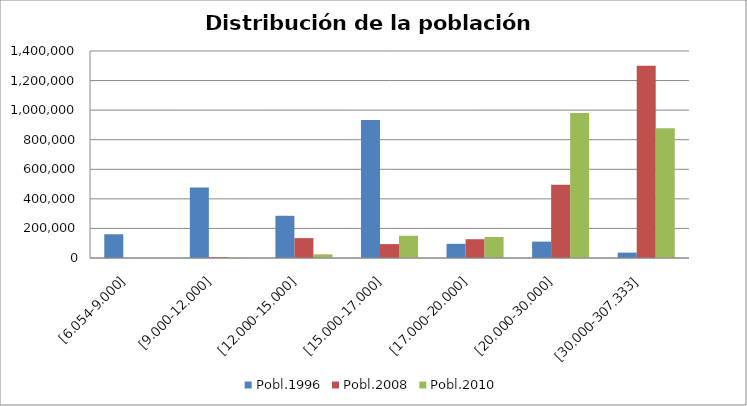
| Category | Pobl.1996 | Pobl.2008 | Pobl.2010 |
|---|---|---|---|
| [6.054-9.000] | 160674 | 396 | 0 |
| [9.000-12.000] | 476202 | 5177 | 1850 |
| [12.000-15.000] | 285422 | 134319 | 24775 |
| [15.000-17.000] | 932822 | 93927 | 150680 |
| [17.000-20.000] | 95812 | 126996 | 142264 |
| [20.000-30.000] | 110720 | 495403 | 981462 |
| [30.000-307.333] | 36403 | 1300895 | 877308 |